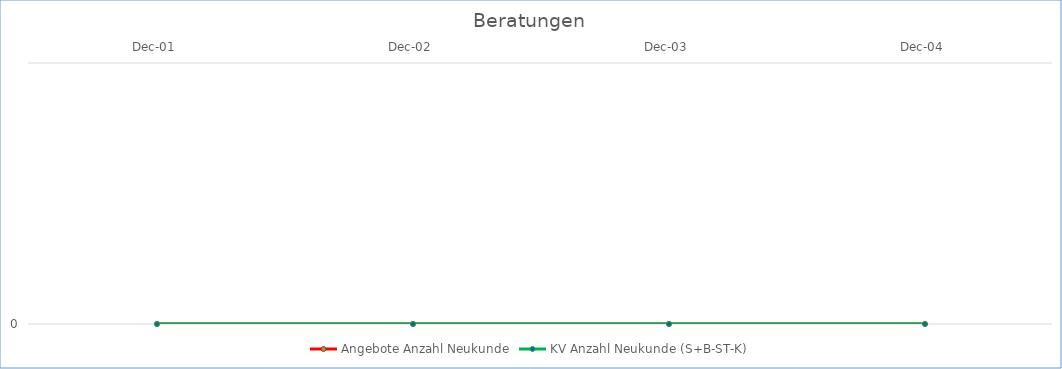
| Category | Angebote Anzahl Neukunde | KV Anzahl Neukunde (S+B-ST-K) |
|---|---|---|
| 2001-12-01 | 0 | 0 |
| 2002-12-01 | 0 | 0 |
| 2003-12-01 | 0 | 0 |
| 2004-12-01 | 0 | 0 |